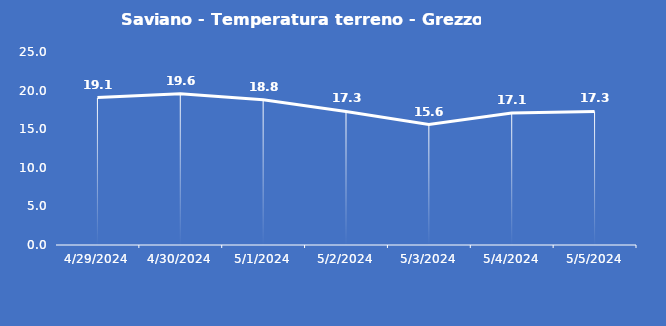
| Category | Saviano - Temperatura terreno - Grezzo (°C) |
|---|---|
| 4/29/24 | 19.1 |
| 4/30/24 | 19.6 |
| 5/1/24 | 18.8 |
| 5/2/24 | 17.3 |
| 5/3/24 | 15.6 |
| 5/4/24 | 17.1 |
| 5/5/24 | 17.3 |